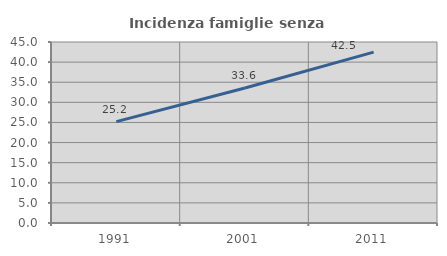
| Category | Incidenza famiglie senza nuclei |
|---|---|
| 1991.0 | 25.202 |
| 2001.0 | 33.555 |
| 2011.0 | 42.495 |